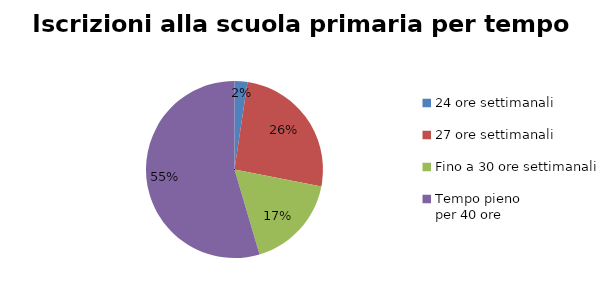
| Category | Series 0 |
|---|---|
| 24 ore settimanali | 835 |
| 27 ore settimanali | 9141 |
| Fino a 30 ore settimanali | 6172 |
| Tempo pieno 
per 40 ore | 19395 |